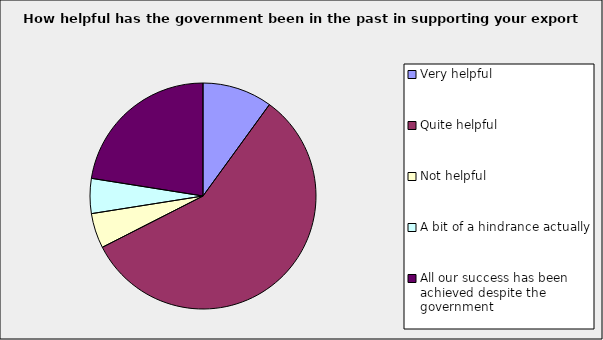
| Category | Series 0 |
|---|---|
| Very helpful | 0.1 |
| Quite helpful | 0.575 |
| Not helpful | 0.05 |
| A bit of a hindrance actually | 0.05 |
| All our success has been achieved despite the government | 0.225 |